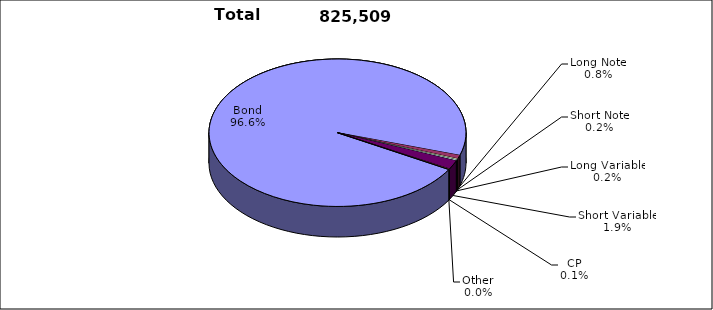
| Category | Trades |
|---|---|
| Bond | 797651 |
| Long Note | 6560 |
| Short Note | 1903 |
| Long Variable | 1989 |
| Short Variable | 16088 |
| CP | 981 |
| Other | 337 |